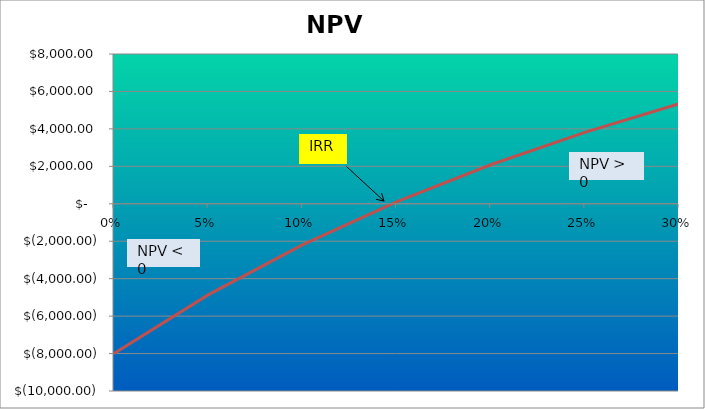
| Category | NPV |
|---|---|
| 0.0 | -8000 |
| 0.05 | -4867.185 |
| 0.1 | -2197.596 |
| 0.15 | 96.573 |
| 0.2 | 2083.333 |
| 0.25 | 3816 |
| 0.3 | 5336.823 |